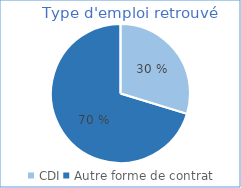
| Category | Series 0 |
|---|---|
| 0 | 0.11 |
| 1 | 0.26 |